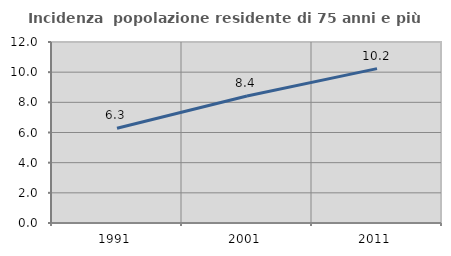
| Category | Incidenza  popolazione residente di 75 anni e più |
|---|---|
| 1991.0 | 6.281 |
| 2001.0 | 8.424 |
| 2011.0 | 10.236 |